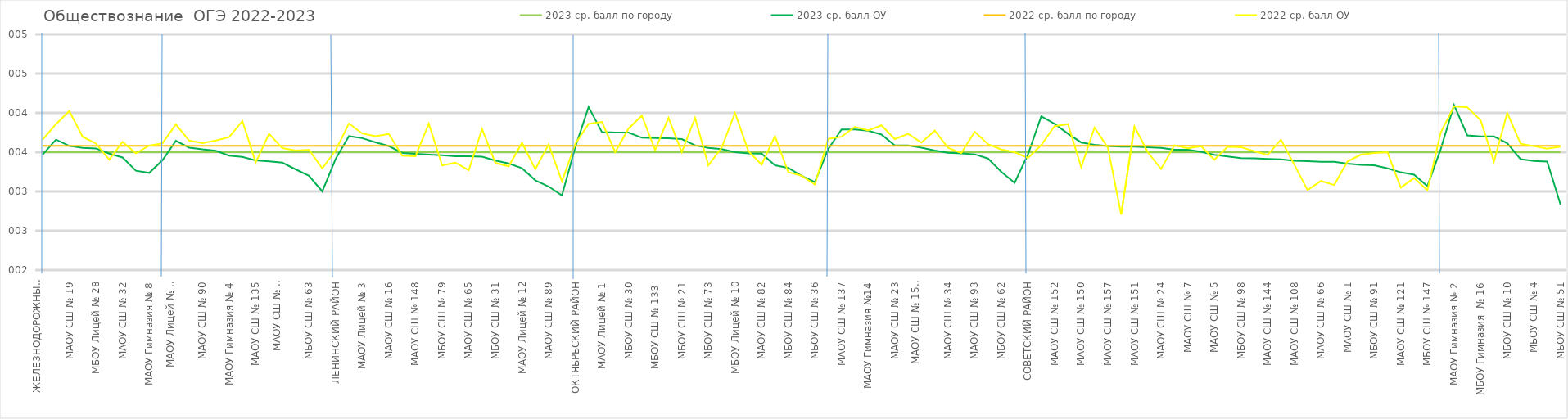
| Category | 2023 ср. балл по городу | 2023 ср. балл ОУ | 2022 ср. балл по городу | 2022 ср. балл ОУ |
|---|---|---|---|---|
| ЖЕЛЕЗНОДОРОЖНЫЙ РАЙОН | 3.5 | 3.469 | 3.58 | 3.662 |
| МАОУ Лицей № 7  | 3.5 | 3.66 | 3.58 | 3.857 |
| МАОУ СШ № 19 | 3.5 | 3.58 | 3.58 | 4.024 |
| МАОУ Гимназия № 9 | 3.5 | 3.554 | 3.58 | 3.696 |
| МБОУ Лицей № 28 | 3.5 | 3.548 | 3.58 | 3.61 |
| МБОУ СШ № 86 | 3.5 | 3.481 | 3.58 | 3.404 |
| МАОУ СШ № 32 | 3.5 | 3.432 | 3.58 | 3.632 |
| МАОУ СШ № 12 | 3.5 | 3.264 | 3.58 | 3.486 |
| МАОУ Гимназия № 8 | 3.5 | 3.236 | 3.58 | 3.583 |
| КИРОВСКИЙ РАЙОН | 3.5 | 3.398 | 3.58 | 3.613 |
| МАОУ Лицей № 6 "Перспектива" | 3.5 | 3.644 | 3.58 | 3.854 |
| МАОУ СШ № 46 | 3.5 | 3.558 | 3.58 | 3.648 |
| МАОУ СШ № 90 | 3.5 | 3.535 | 3.58 | 3.615 |
| МАОУ Гимназия № 6 | 3.5 | 3.517 | 3.58 | 3.649 |
| МАОУ Гимназия № 4 | 3.5 | 3.457 | 3.58 | 3.691 |
| МАОУ Гимназия № 10 | 3.5 | 3.44 | 3.58 | 3.896 |
| МАОУ СШ № 135 | 3.5 | 3.395 | 3.58 | 3.368 |
| МАОУ Лицей № 11 | 3.5 | 3.383 | 3.58 | 3.733 |
| МАОУ СШ № 8 "Созидание" | 3.5 | 3.367 | 3.58 | 3.551 |
| МАОУ СШ № 55 | 3.5 | 3.281 | 3.58 | 3.52 |
| МБОУ СШ № 63 | 3.5 | 3.2 | 3.58 | 3.532 |
| МАОУ СШ № 81 | 3.5 | 3 | 3.58 | 3.293 |
| ЛЕНИНСКИЙ РАЙОН | 3.5 | 3.413 | 3.58 | 3.522 |
| МАОУ Гимназия № 15 | 3.5 | 3.704 | 3.58 | 3.864 |
| МАОУ Лицей № 3 | 3.5 | 3.679 | 3.58 | 3.738 |
| МБОУ Гимназия № 7 | 3.5 | 3.625 | 3.58 | 3.702 |
| МАОУ СШ № 16 | 3.5 | 3.578 | 3.58 | 3.731 |
| МБОУ СШ № 94 | 3.5 | 3.491 | 3.58 | 3.455 |
| МАОУ СШ № 148 | 3.5 | 3.478 | 3.58 | 3.449 |
| МАОУ Гимназия № 11 | 3.5 | 3.469 | 3.58 | 3.863 |
| МБОУ СШ № 79 | 3.5 | 3.462 | 3.58 | 3.333 |
| МАОУ СШ № 53 | 3.5 | 3.448 | 3.58 | 3.365 |
| МАОУ СШ № 65 | 3.5 | 3.447 | 3.58 | 3.271 |
| МБОУ СШ № 64 | 3.5 | 3.443 | 3.58 | 3.794 |
| МБОУ СШ № 31 | 3.5 | 3.393 | 3.58 | 3.364 |
| МБОУ СШ № 13 | 3.5 | 3.357 | 3.58 | 3.32 |
| МАОУ Лицей № 12 | 3.5 | 3.295 | 3.58 | 3.62 |
| МБОУ СШ № 44 | 3.5 | 3.143 | 3.58 | 3.283 |
| МАОУ СШ № 89 | 3.5 | 3.062 | 3.58 | 3.6 |
| МАОУ СШ № 50 | 3.5 | 2.95 | 3.58 | 3.13 |
| ОКТЯБРЬСКИЙ РАЙОН | 3.5 | 3.563 | 3.58 | 3.605 |
| МАОУ Гимназия № 13 "Академ" | 3.5 | 4.075 | 3.58 | 3.86 |
| МАОУ Лицей № 1 | 3.5 | 3.757 | 3.58 | 3.885 |
| МБОУ СШ № 3 | 3.5 | 3.75 | 3.58 | 3.5 |
| МБОУ СШ № 30 | 3.5 | 3.75 | 3.58 | 3.8 |
| МБОУ Гимназия № 3 | 3.5 | 3.684 | 3.58 | 3.967 |
| МБОУ СШ № 133  | 3.5 | 3.68 | 3.58 | 3.525 |
| МАОУ "КУГ №1 - Универс" | 3.5 | 3.678 | 3.58 | 3.937 |
| МБОУ СШ № 21 | 3.5 | 3.667 | 3.58 | 3.5 |
| МБОУ Лицей № 8 | 3.5 | 3.587 | 3.58 | 3.936 |
| МБОУ СШ № 73 | 3.5 | 3.556 | 3.58 | 3.333 |
| МБОУ СШ № 72  | 3.5 | 3.538 | 3.58 | 3.559 |
| МБОУ Лицей № 10 | 3.5 | 3.5 | 3.58 | 4 |
| МБОУ СШ № 95 | 3.5 | 3.483 | 3.58 | 3.514 |
| МАОУ СШ № 82 | 3.5 | 3.483 | 3.58 | 3.341 |
| МБОУ СШ № 99 | 3.5 | 3.333 | 3.58 | 3.705 |
| МБОУ СШ № 84 | 3.5 | 3.3 | 3.58 | 3.244 |
| МБОУ СШ № 39 | 3.5 | 3.2 | 3.58 | 3.2 |
| МБОУ СШ № 36 | 3.5 | 3.118 | 3.58 | 3.088 |
| СВЕРДЛОВСКИЙ РАЙОН | 3.5 | 3.54 | 3.58 | 3.67 |
| МАОУ СШ № 137 | 3.5 | 3.789 | 3.58 | 3.696 |
| МАОУ Лицей № 9 "Лидер" | 3.5 | 3.788 | 3.58 | 3.822 |
| МАОУ Гимназия №14 | 3.5 | 3.773 | 3.58 | 3.778 |
| МАОУ СШ № 42 | 3.5 | 3.725 | 3.58 | 3.841 |
| МАОУ СШ № 23 | 3.5 | 3.587 | 3.58 | 3.667 |
| МАОУ СШ № 17 | 3.5 | 3.585 | 3.58 | 3.733 |
| МАОУ СШ № 158 "Грани" | 3.5 | 3.557 | 3.58 | 3.622 |
| МАОУ СШ № 6 | 3.5 | 3.521 | 3.58 | 3.775 |
| МАОУ СШ № 34 | 3.5 | 3.493 | 3.58 | 3.556 |
| МАОУ СШ № 45 | 3.5 | 3.484 | 3.58 | 3.488 |
| МАОУ СШ № 93 | 3.5 | 3.473 | 3.58 | 3.76 |
| МАОУ СШ № 76 | 3.5 | 3.419 | 3.58 | 3.603 |
| МБОУ СШ № 62 | 3.5 | 3.25 | 3.58 | 3.533 |
| МАОУ СШ № 78 | 3.5 | 3.109 | 3.58 | 3.5 |
| СОВЕТСКИЙ РАЙОН | 3.5 | 3.471 | 3.58 | 3.427 |
| МАОУ СШ № 139 | 3.5 | 3.957 | 3.58 | 3.591 |
| МАОУ СШ № 152 | 3.5 | 3.861 | 3.58 | 3.831 |
| МАОУ СШ № 154 | 3.5 | 3.736 | 3.58 | 3.857 |
| МАОУ СШ № 150 | 3.5 | 3.623 | 3.58 | 3.31 |
| МАОУ СШ № 149 | 3.5 | 3.595 | 3.58 | 3.813 |
| МАОУ СШ № 157 | 3.5 | 3.579 | 3.58 | 3.559 |
| МАОУ СШ № 69 | 3.5 | 3.571 | 3.58 | 2.708 |
| МАОУ СШ № 151 | 3.5 | 3.571 | 3.58 | 3.826 |
| МАОУ СШ № 141 | 3.5 | 3.562 | 3.58 | 3.5 |
| МАОУ СШ № 24 | 3.5 | 3.554 | 3.58 | 3.286 |
| МБОУ СШ № 56 | 3.5 | 3.531 | 3.58 | 3.588 |
| МАОУ СШ № 7 | 3.5 | 3.531 | 3.58 | 3.549 |
| МАОУ СШ № 145 | 3.5 | 3.506 | 3.58 | 3.576 |
| МАОУ СШ № 5 | 3.5 | 3.467 | 3.58 | 3.403 |
| МАОУ СШ № 143 | 3.5 | 3.446 | 3.58 | 3.57 |
| МБОУ СШ № 98 | 3.5 | 3.425 | 3.58 | 3.564 |
| МАОУ СШ № 115 | 3.5 | 3.422 | 3.58 | 3.514 |
| МАОУ СШ № 144 | 3.5 | 3.415 | 3.58 | 3.464 |
| МАОУ СШ № 85 | 3.5 | 3.41 | 3.58 | 3.66 |
| МАОУ СШ № 108 | 3.5 | 3.391 | 3.58 | 3.343 |
| МБОУ СШ № 129 | 3.5 | 3.385 | 3.58 | 3.017 |
| МАОУ СШ № 66 | 3.5 | 3.378 | 3.58 | 3.133 |
| МАОУ СШ № 156 | 3.5 | 3.378 | 3.58 | 3.082 |
| МАОУ СШ № 1 | 3.5 | 3.355 | 3.58 | 3.382 |
| МАОУ СШ № 18 | 3.5 | 3.338 | 3.58 | 3.469 |
| МБОУ СШ № 91 | 3.5 | 3.333 | 3.58 | 3.49 |
| МБОУ СШ № 2 | 3.5 | 3.294 | 3.58 | 3.5 |
| МАОУ СШ № 121 | 3.5 | 3.244 | 3.58 | 3.048 |
| МАОУ СШ № 134 | 3.5 | 3.214 | 3.58 | 3.171 |
| МБОУ СШ № 147 | 3.5 | 3.068 | 3.58 | 3.015 |
| ЦЕНТРАЛЬНЫЙ РАЙОН | 3.5 | 3.538 | 3.58 | 3.749 |
| МАОУ Гимназия № 2 | 3.5 | 4.1 | 3.58 | 4.083 |
| МБОУ Лицей № 2 | 3.5 | 3.714 | 3.58 | 4.071 |
| МБОУ Гимназия  № 16 | 3.5 | 3.7 | 3.58 | 3.905 |
| МАОУ СШ № 155 | 3.5 | 3.7 | 3.58 | 3.381 |
| МБОУ СШ № 10 | 3.5 | 3.614 | 3.58 | 4 |
| МАОУ СШ Комплекс "Покровский" | 3.5 | 3.411 | 3.58 | 3.608 |
| МБОУ СШ № 4 | 3.5 | 3.389 | 3.58 | 3.577 |
| МБОУ СШ № 27 | 3.5 | 3.381 | 3.58 | 3.545 |
| МБОУ СШ № 51 | 3.5 | 2.833 | 3.58 | 3.571 |